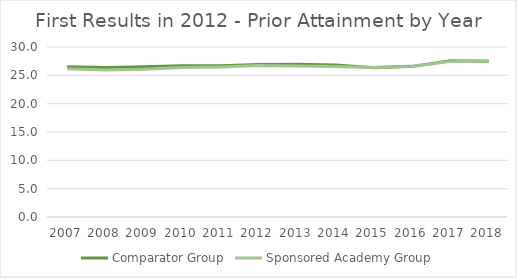
| Category | Comparator Group | Sponsored Academy Group |
|---|---|---|
| 2007.0 | 26.511 | 26.16 |
| 2008.0 | 26.366 | 25.933 |
| 2009.0 | 26.498 | 26.072 |
| 2010.0 | 26.689 | 26.375 |
| 2011.0 | 26.71 | 26.485 |
| 2012.0 | 26.929 | 26.726 |
| 2013.0 | 26.973 | 26.65 |
| 2014.0 | 26.81 | 26.58 |
| 2015.0 | 26.36 | 26.398 |
| 2016.0 | 26.581 | 26.542 |
| 2017.0 | 27.587 | 27.462 |
| 2018.0 | 27.506 | 27.568 |